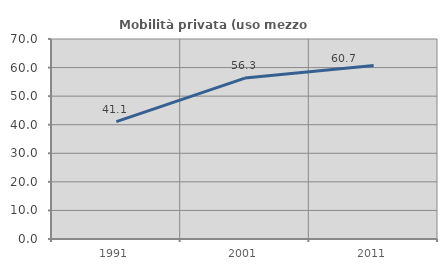
| Category | Mobilità privata (uso mezzo privato) |
|---|---|
| 1991.0 | 41.056 |
| 2001.0 | 56.31 |
| 2011.0 | 60.702 |